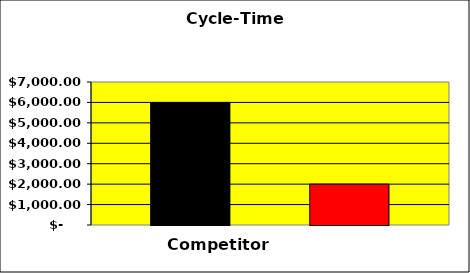
| Category | Series 0 | Series 1 | Series 2 |
|---|---|---|---|
| 0 | 6000 |  | 2000 |